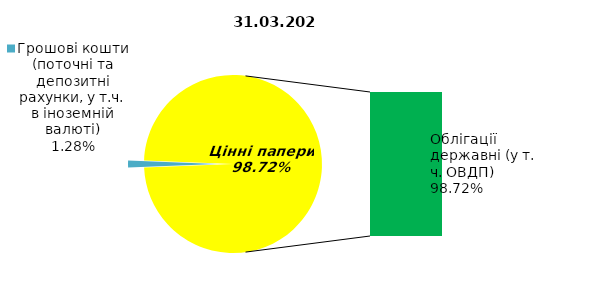
| Category | Series 0 |
|---|---|
| Грошові кошти (поточні та депозитні рахунки, у т.ч. в іноземній валюті) | 1.889 |
| Банківські метали | 0 |
| Нерухомість | 0 |
| Інші активи | 0 |
| Акції | 0 |
| Корпоративні облігації  | 0 |
| Облігації місцевих позик | 0 |
| Облігації державні (у т. ч. ОВДП) | 146.088 |
| Іпотечні сертифікати | 0 |